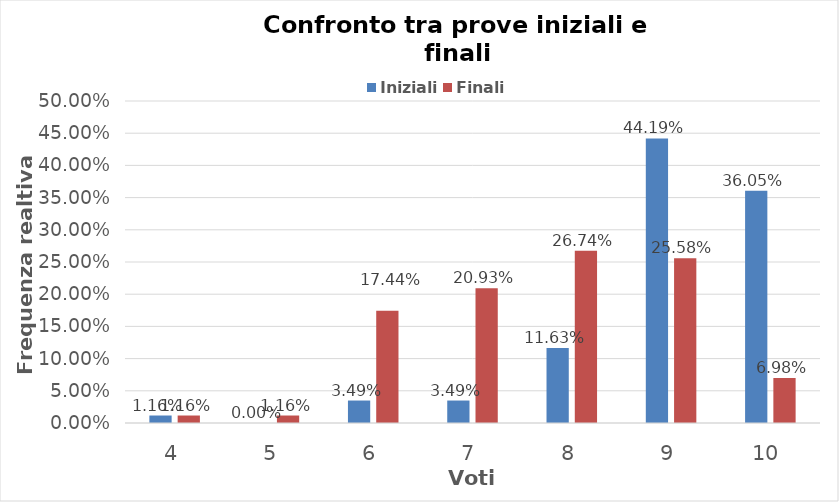
| Category | Iniziali | Finali |
|---|---|---|
| 4.0 | 0.012 | 0.012 |
| 5.0 | 0 | 0.012 |
| 6.0 | 0.035 | 0.174 |
| 7.0 | 0.035 | 0.209 |
| 8.0 | 0.116 | 0.267 |
| 9.0 | 0.442 | 0.256 |
| 10.0 | 0.36 | 0.07 |